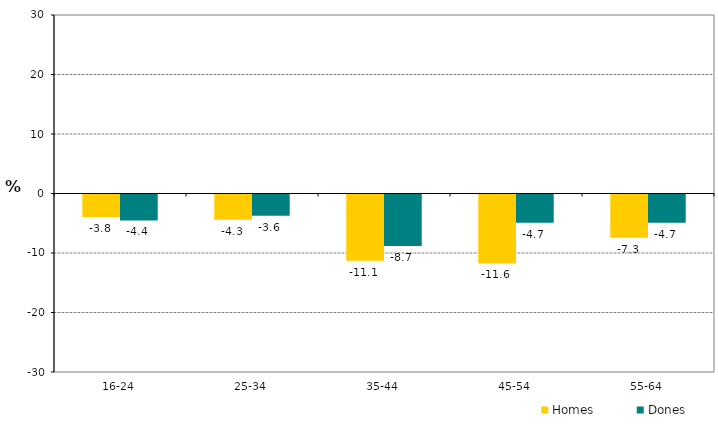
| Category | Homes | Dones |
|---|---|---|
| 16-24 | -3.79 | -4.358 |
| 25-34 | -4.257 | -3.556 |
| 35-44 | -11.134 | -8.652 |
| 45-54 | -11.594 | -4.745 |
| 55-64 | -7.261 | -4.74 |